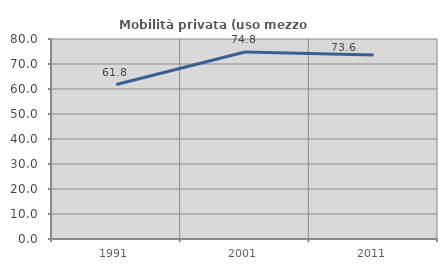
| Category | Mobilità privata (uso mezzo privato) |
|---|---|
| 1991.0 | 61.797 |
| 2001.0 | 74.82 |
| 2011.0 | 73.638 |